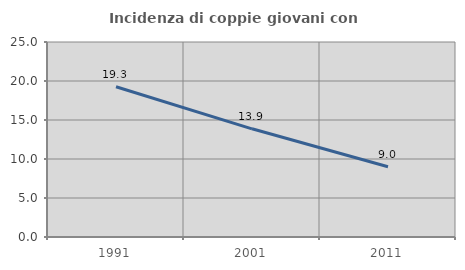
| Category | Incidenza di coppie giovani con figli |
|---|---|
| 1991.0 | 19.258 |
| 2001.0 | 13.87 |
| 2011.0 | 9.007 |